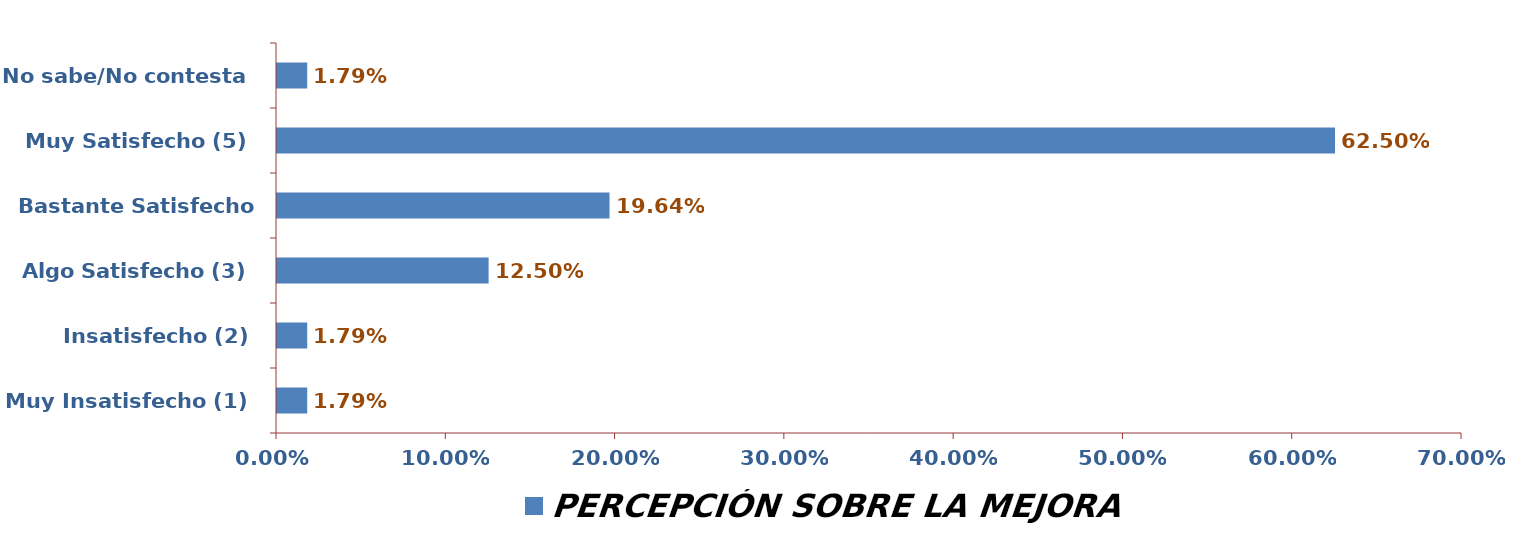
| Category | PERCEPCIÓN SOBRE LA MEJORA |
|---|---|
| Muy Insatisfecho (1) | 0.018 |
| Insatisfecho (2) | 0.018 |
| Algo Satisfecho (3) | 0.125 |
| Bastante Satisfecho (4) | 0.196 |
| Muy Satisfecho (5) | 0.625 |
| No sabe/No contesta | 0.018 |